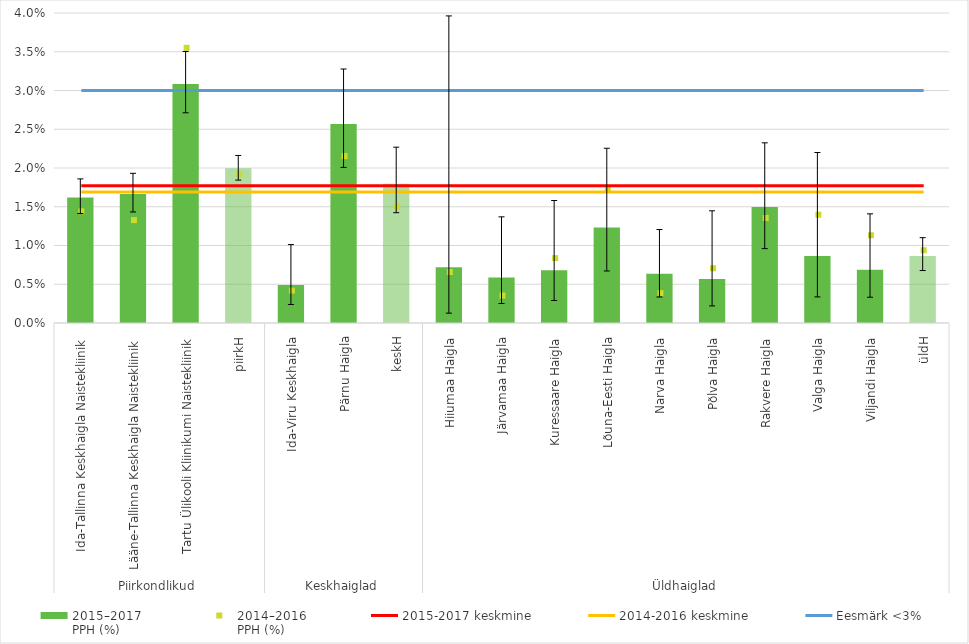
| Category | 2015–2017
PPH (%) |
|---|---|
| 0 | 0.016 |
| 1 | 0.017 |
| 2 | 0.031 |
| 3 | 0.02 |
| 4 | 0.005 |
| 5 | 0.026 |
| 6 | 0.018 |
| 7 | 0.007 |
| 8 | 0.006 |
| 9 | 0.007 |
| 10 | 0.012 |
| 11 | 0.006 |
| 12 | 0.006 |
| 13 | 0.015 |
| 14 | 0.009 |
| 15 | 0.007 |
| 16 | 0.009 |